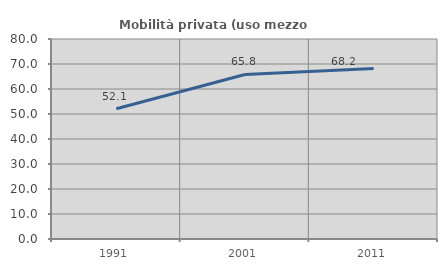
| Category | Mobilità privata (uso mezzo privato) |
|---|---|
| 1991.0 | 52.099 |
| 2001.0 | 65.8 |
| 2011.0 | 68.175 |